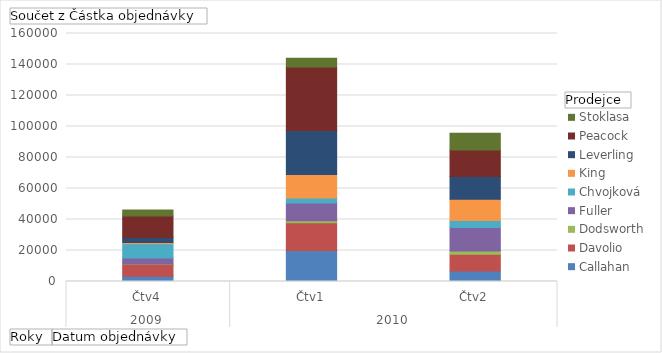
| Category | Callahan | Davolio | Dodsworth | Fuller | Chvojková | King | Leverling | Peacock | Stoklasa |
|---|---|---|---|---|---|---|---|---|---|
| 0 | 3425.4 | 7708.08 | 166 | 3781.86 | 9314.1 | 834.2 | 3162 | 13936.6 | 3850.54 |
| 1 | 19992.23 | 17885.82 | 1310.8 | 11434.38 | 3237.12 | 15108.34 | 28406.85 | 41088.53 | 5583.16 |
| 2 | 6764.4 | 10774.96 | 2209.78 | 15065.17 | 4500.27 | 13672.62 | 14818.75 | 16985.44 | 10780.4 |